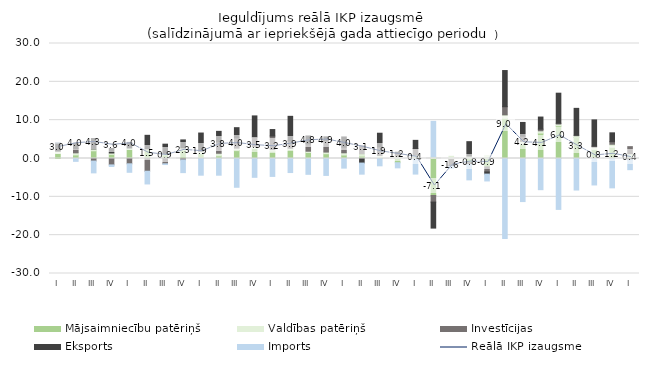
| Category | Mājsaimniecību patēriņš | Valdības patēriņš | Investīcijas | Eksports | Imports |
|---|---|---|---|---|---|
| I | 1.358 | 0.593 | 0.023 | 2.081 | 0.02 |
| II | 0.934 | 0.546 | 1.114 | 1.378 | -0.747 |
| III | 2.009 | 0.5 | -0.668 | 2.7 | -3.081 |
| IV | 1.074 | 0.363 | -1.672 | 1.167 | -0.418 |
| I | 2.415 | 0.323 | -1.383 | 1.457 | -2.215 |
| II | 2.209 | 0.31 | -3.325 | 3.528 | -3.317 |
| III | 0.947 | 0.373 | -1.386 | 2.419 | -0.189 |
| IV | 2.204 | 0.537 | -0.371 | 2.109 | -3.313 |
| I | 1.284 | 0.592 | 0.29 | 4.479 | -4.353 |
| II | 0.69 | 0.679 | 2.957 | 2.753 | -4.358 |
| III | 2.058 | 0.654 | 2.686 | 2.644 | -7.507 |
| IV | 2.574 | 0.538 | 2.384 | 5.614 | -4.907 |
| I | 1.904 | 0.429 | 3.535 | 1.685 | -4.675 |
| II | 2.345 | 0.331 | 1.915 | 6.41 | -3.664 |
| III | 1.568 | 0.331 | 1.945 | 2.033 | -4.13 |
| IV | 1.25 | 0.427 | 3.022 | 0.959 | -4.412 |
| I | 0.907 | 0.584 | 1.475 | 2.658 | -2.512 |
| II | 0.618 | 0.661 | 2.018 | -1.189 | -2.896 |
| III | 0.172 | 0.631 | 2.214 | 3.578 | -1.909 |
| IV | -1.103 | 0.59 | 0.737 | 0.315 | -1.335 |
| I | 0.392 | 0.47 | 1.71 | 2.161 | -4.063 |
| II | -9.648 | 0.413 | -1.723 | -6.783 | 9.273 |
| III | -0.266 | 0.569 | -1.526 | -0.244 | -0.528 |
| IV | -1.087 | 0.625 | -0.457 | 3.765 | -4.03 |
| I | -2.185 | 0.775 | -1.327 | -0.556 | -1.791 |
| II | 10.473 | 0.92 | 2.118 | 9.432 | -20.866 |
| III | 3.765 | 0.725 | 1.338 | 3.576 | -11.235 |
| IV | 6.641 | 0.593 | 0.412 | 3.167 | -8.135 |
| I | 8.537 | 0.454 | 0.202 | 7.843 | -13.279 |
| II | 5.462 | 0.489 | 0.121 | 7.008 | -8.228 |
| III | 2.325 | 0.607 | 0.289 | 6.852 | -6.903 |
| IV | 2.919 | 0.797 | 0.662 | 2.319 | -7.657 |
| I | 0.31 | 0.934 | 1.847 | -0.332 | -2.583 |